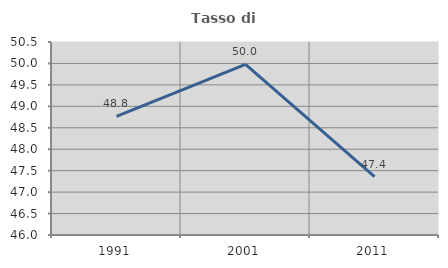
| Category | Tasso di occupazione   |
|---|---|
| 1991.0 | 48.767 |
| 2001.0 | 49.98 |
| 2011.0 | 47.361 |